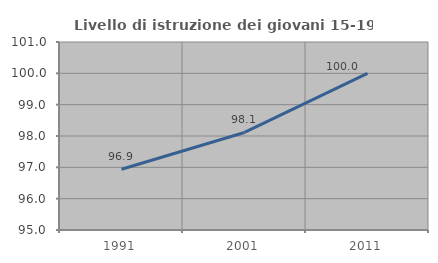
| Category | Livello di istruzione dei giovani 15-19 anni |
|---|---|
| 1991.0 | 96.939 |
| 2001.0 | 98.113 |
| 2011.0 | 100 |